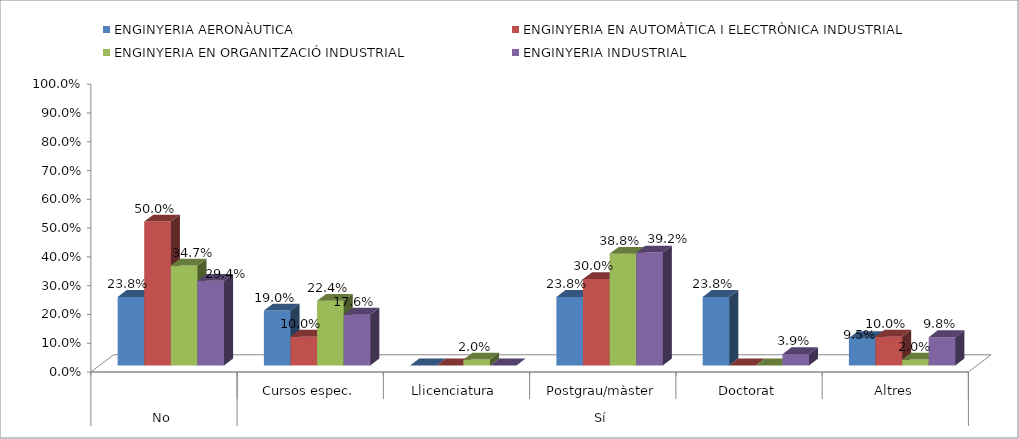
| Category | ENGINYERIA AERONÀUTICA | ENGINYERIA EN AUTOMÀTICA I ELECTRÒNICA INDUSTRIAL | ENGINYERIA EN ORGANITZACIÓ INDUSTRIAL | ENGINYERIA INDUSTRIAL |
|---|---|---|---|---|
| 0 | 0.238 | 0.5 | 0.347 | 0.294 |
| 1 | 0.19 | 0.1 | 0.224 | 0.176 |
| 2 | 0 | 0 | 0.02 | 0 |
| 3 | 0.238 | 0.3 | 0.388 | 0.392 |
| 4 | 0.238 | 0 | 0 | 0.039 |
| 5 | 0.095 | 0.1 | 0.02 | 0.098 |